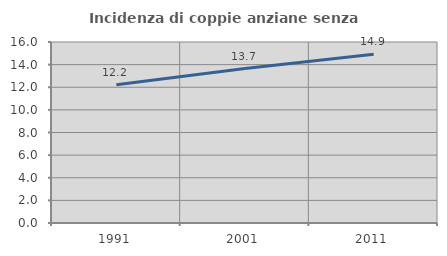
| Category | Incidenza di coppie anziane senza figli  |
|---|---|
| 1991.0 | 12.226 |
| 2001.0 | 13.652 |
| 2011.0 | 14.927 |